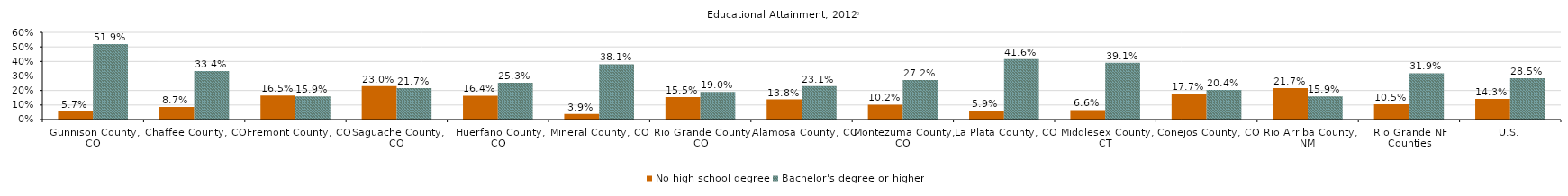
| Category | No high school degree | Bachelor's degree or higher |
|---|---|---|
| Gallatin County, MT | 0.039 | 0.454 |
| County Region | 0.039 | 0.454 |
| U.S. | 0.143 | 0.285 |